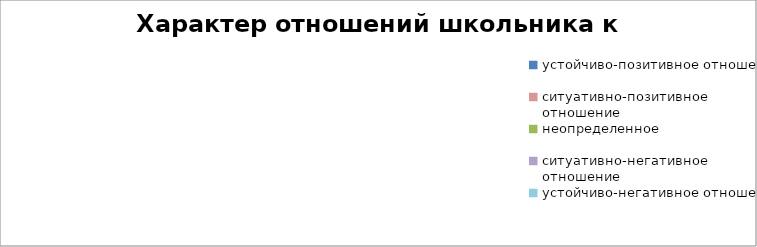
| Category | Series 0 |
|---|---|
| устойчиво-позитивное отношение | 0 |
| ситуативно-позитивное отношение | 0 |
| неопределенное | 0 |
| ситуативно-негативное отношение | 0 |
| устойчиво-негативное отношение | 0 |